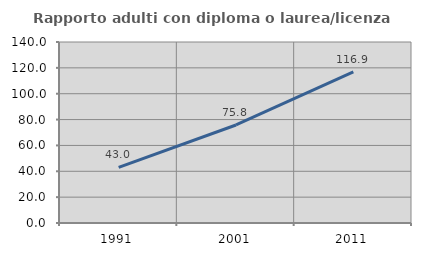
| Category | Rapporto adulti con diploma o laurea/licenza media  |
|---|---|
| 1991.0 | 43.049 |
| 2001.0 | 75.821 |
| 2011.0 | 116.898 |